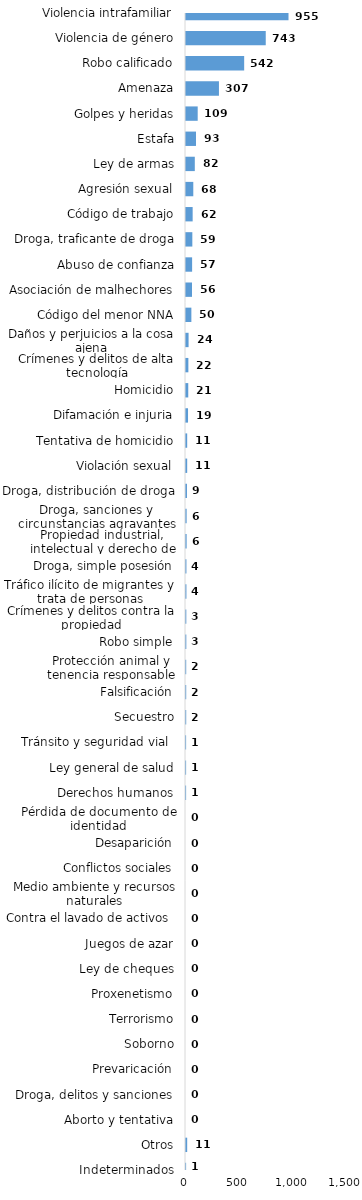
| Category | Series 0 |
|---|---|
| Violencia intrafamiliar | 955 |
| Violencia de género | 743 |
| Robo calificado | 542 |
| Amenaza | 307 |
| Golpes y heridas | 109 |
| Estafa | 93 |
| Ley de armas | 82 |
| Agresión sexual | 68 |
| Código de trabajo | 62 |
| Droga, traficante de droga | 59 |
| Abuso de confianza | 57 |
| Asociación de malhechores | 56 |
| Código del menor NNA | 50 |
| Daños y perjuicios a la cosa ajena | 24 |
| Crímenes y delitos de alta tecnología | 22 |
| Homicidio | 21 |
| Difamación e injuria | 19 |
| Tentativa de homicidio | 11 |
| Violación sexual | 11 |
| Droga, distribución de droga | 9 |
| Droga, sanciones y circunstancias agravantes | 6 |
| Propiedad industrial, intelectual y derecho de autor | 6 |
| Droga, simple posesión | 4 |
| Tráfico ilícito de migrantes y trata de personas | 4 |
| Crímenes y delitos contra la propiedad | 3 |
| Robo simple | 3 |
| Protección animal y tenencia responsable | 2 |
| Falsificación | 2 |
| Secuestro | 2 |
| Tránsito y seguridad vial  | 1 |
| Ley general de salud | 1 |
| Derechos humanos | 1 |
| Pérdida de documento de identidad | 0 |
| Desaparición | 0 |
| Conflictos sociales | 0 |
| Medio ambiente y recursos naturales | 0 |
| Contra el lavado de activos  | 0 |
| Juegos de azar | 0 |
| Ley de cheques | 0 |
| Proxenetismo | 0 |
| Terrorismo | 0 |
| Soborno | 0 |
| Prevaricación | 0 |
| Droga, delitos y sanciones | 0 |
| Aborto y tentativa | 0 |
| Otros | 11 |
| Indeterminados | 1 |